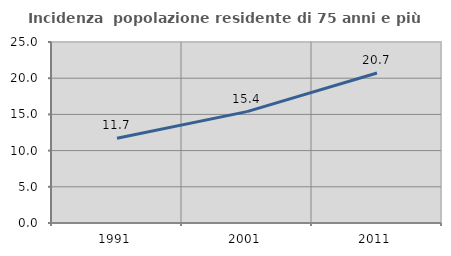
| Category | Incidenza  popolazione residente di 75 anni e più |
|---|---|
| 1991.0 | 11.705 |
| 2001.0 | 15.385 |
| 2011.0 | 20.723 |